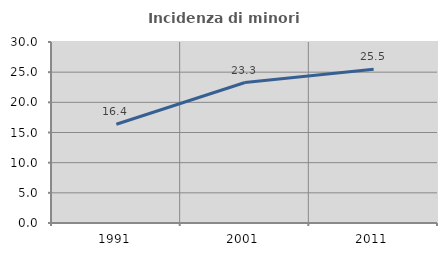
| Category | Incidenza di minori stranieri |
|---|---|
| 1991.0 | 16.364 |
| 2001.0 | 23.284 |
| 2011.0 | 25.487 |